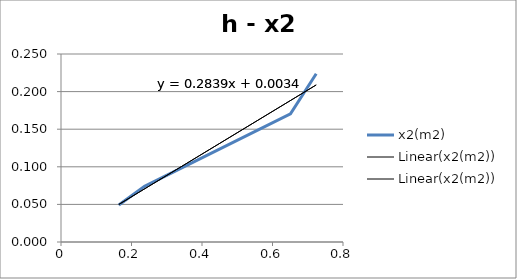
| Category | x2(m2) |
|---|---|
| 0.164 | 0.049 |
| 0.237 | 0.074 |
| 0.651 | 0.171 |
| 0.724 | 0.224 |